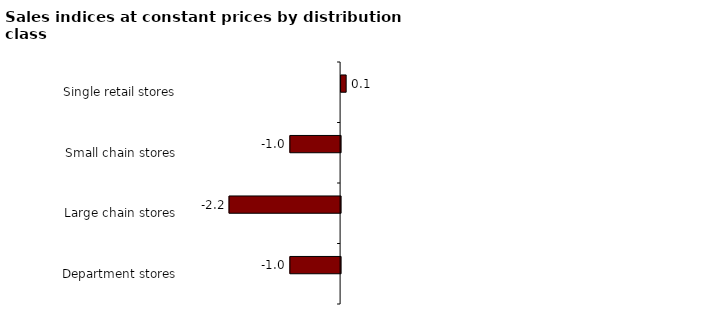
| Category | Series 0 | Series 1 |
|---|---|---|
| Department stores |  | -1 |
| Large chain stores |  | -2.2 |
| Small chain stores |  | -1 |
| Single retail stores |  | 0.1 |